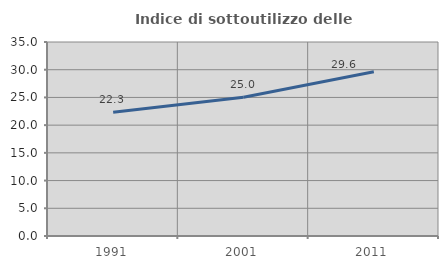
| Category | Indice di sottoutilizzo delle abitazioni  |
|---|---|
| 1991.0 | 22.321 |
| 2001.0 | 25.021 |
| 2011.0 | 29.643 |